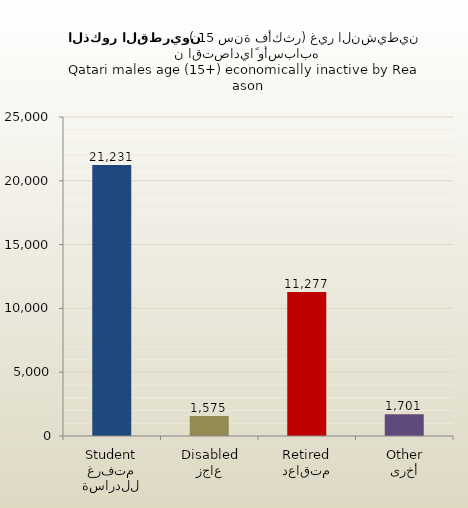
| Category | الذكور القطريين |
|---|---|
| متفرغ للدراسة
Student | 21231 |
| عاجز
Disabled | 1575 |
| متقاعد
Retired | 11277 |
| أخرى
Other | 1701 |